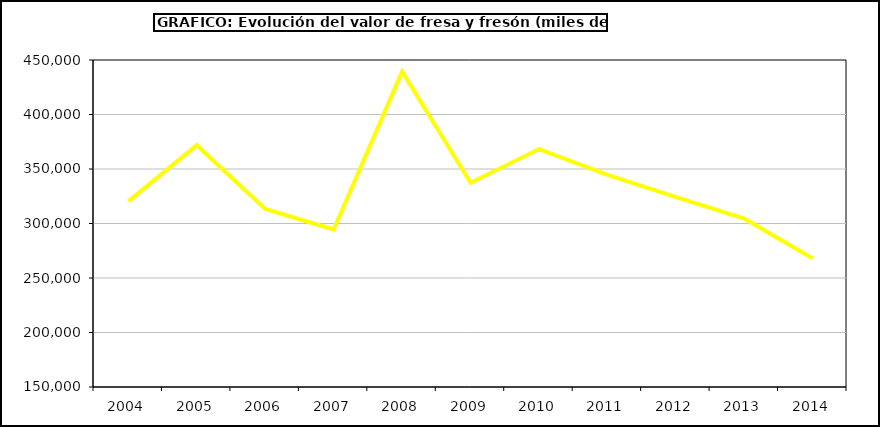
| Category | Valor |
|---|---|
| 2004.0 | 320257.22 |
| 2005.0 | 371836.542 |
| 2006.0 | 313299.78 |
| 2007.0 | 294464.98 |
| 2008.0 | 439353.128 |
| 2009.0 | 337386.548 |
| 2010.0 | 368287.313 |
| 2011.0 | 344604.077 |
| 2012.0 | 324144.524 |
| 2013.0 | 304404.377 |
| 2014.0 | 267944.247 |